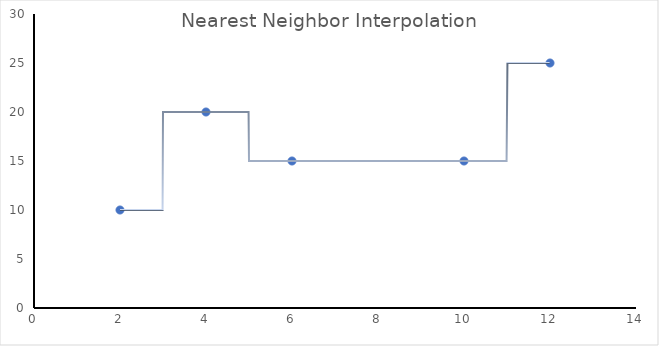
| Category | Y |
|---|---|
| 2.0 | 10 |
| 4.0 | 20 |
| 6.0 | 15 |
| 10.0 | 15 |
| 12.0 | 25 |